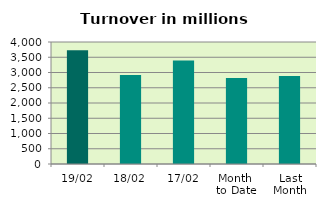
| Category | Series 0 |
|---|---|
| 19/02 | 3729.304 |
| 18/02 | 2920.964 |
| 17/02 | 3394.463 |
| Month 
to Date | 2823.462 |
| Last
Month | 2888.221 |